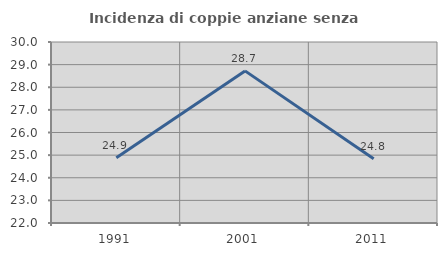
| Category | Incidenza di coppie anziane senza figli  |
|---|---|
| 1991.0 | 24.887 |
| 2001.0 | 28.723 |
| 2011.0 | 24.837 |